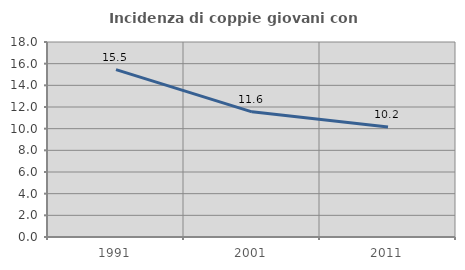
| Category | Incidenza di coppie giovani con figli |
|---|---|
| 1991.0 | 15.451 |
| 2001.0 | 11.554 |
| 2011.0 | 10.15 |